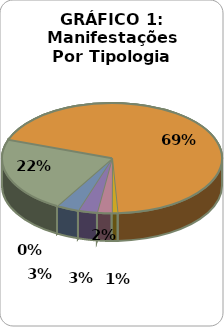
| Category | ABRIL | MAIO | JUNHO |
|---|---|---|---|
| SOLICITAÇÕES | 213 | 206 | 133 |
| RECLAMAÇÕES | 577 | 574 | 414 |
| DENÚNCIAS | 11 | 9 | 5 |
| ELOGIOS | 15 | 15 | 13 |
| SUGESTÕES | 28 | 20 | 17 |
| INFORMAÇÕES | 30 | 23 | 20 |
| DEN/LICITAÇÕES | 0 | 0 | 0 |